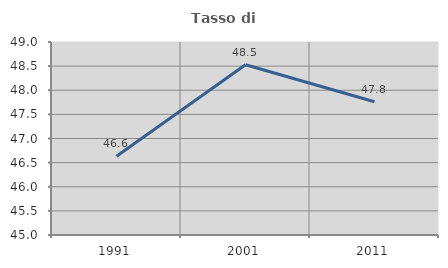
| Category | Tasso di occupazione   |
|---|---|
| 1991.0 | 46.633 |
| 2001.0 | 48.529 |
| 2011.0 | 47.761 |